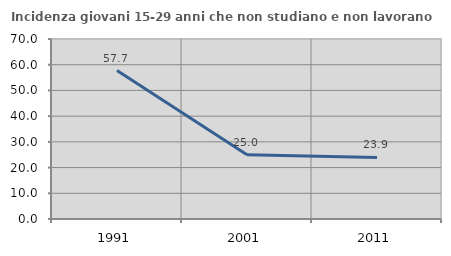
| Category | Incidenza giovani 15-29 anni che non studiano e non lavorano  |
|---|---|
| 1991.0 | 57.714 |
| 2001.0 | 25 |
| 2011.0 | 23.932 |